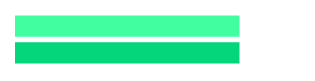
| Category | Actual Income | Budgeted |
|---|---|---|
| 0 | 1500 | 1500 |